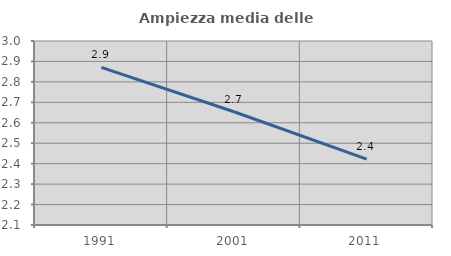
| Category | Ampiezza media delle famiglie |
|---|---|
| 1991.0 | 2.871 |
| 2001.0 | 2.654 |
| 2011.0 | 2.422 |